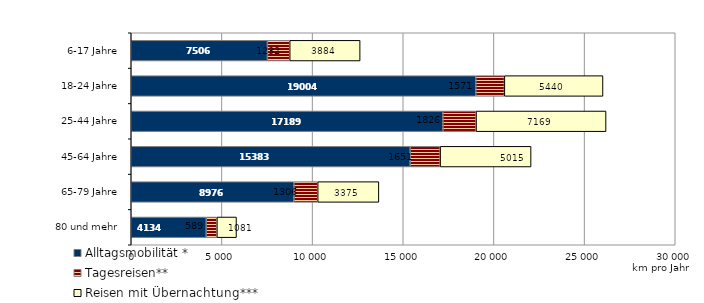
| Category | Alltagsmobilität * | Tagesreisen** | Reisen mit Übernachtung*** |
|---|---|---|---|
| 6-17 Jahre | 7506.048 | 1232.207 | 3883.596 |
| 18-24 Jahre | 19004.301 | 1570.974 | 5439.747 |
| 25-44 Jahre | 17188.849 | 1825.782 | 7169.413 |
| 45-64 Jahre | 15383.115 | 1650.906 | 5014.903 |
| 65-79 Jahre | 8975.548 | 1305.503 | 3374.624 |
| 80 und mehr | 4134.185 | 588.596 | 1080.63 |